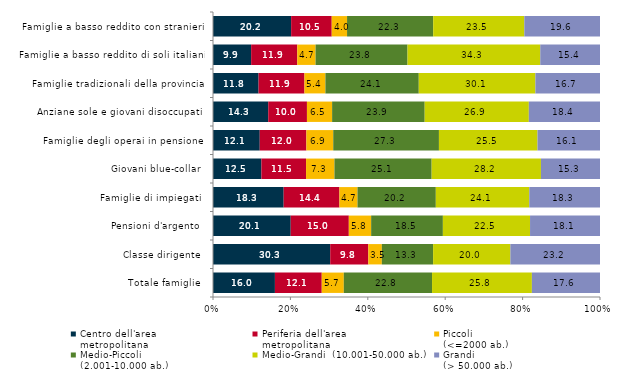
| Category | Centro dell'area 
metropolitana | Periferia dell'area 
metropolitana | Piccoli 
(<=2000 ab.) | Medio-Piccoli 
(2.001-10.000 ab.) | Medio-Grandi  (10.001-50.000 ab.) | Grandi 
(> 50.000 ab.) |
|---|---|---|---|---|---|---|
| Totale famiglie | 16 | 12.1 | 5.7 | 22.8 | 25.8 | 17.6 |
| Classe dirigente | 30.29 | 9.847 | 3.488 | 13.254 | 19.959 | 23.162 |
| Pensioni d'argento | 20.082 | 15.012 | 5.771 | 18.536 | 22.522 | 18.076 |
| Famiglie di impiegati | 18.262 | 14.412 | 4.666 | 20.237 | 24.147 | 18.276 |
| Giovani blue-collar | 12.507 | 11.537 | 7.338 | 25.119 | 28.241 | 15.258 |
| Famiglie degli operai in pensione | 12.082 | 12.047 | 6.941 | 27.311 | 25.472 | 16.147 |
| Anziane sole e giovani disoccupati | 14.277 | 9.997 | 6.507 | 23.919 | 26.909 | 18.39 |
| Famiglie tradizionali della provincia | 11.777 | 11.855 | 5.416 | 24.124 | 30.133 | 16.695 |
| Famiglie a basso reddito di soli italiani | 9.857 | 11.921 | 4.727 | 23.76 | 34.297 | 15.437 |
| Famiglie a basso reddito con stranieri | 20.19 | 10.488 | 3.961 | 22.259 | 23.548 | 19.554 |